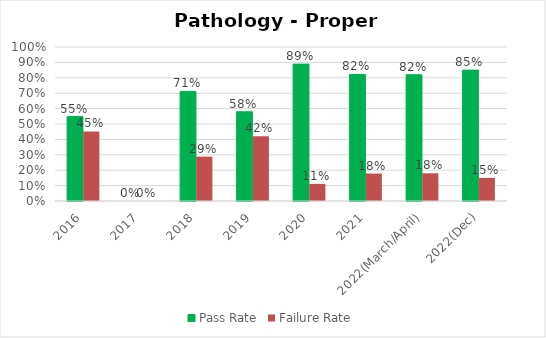
| Category | Pass Rate | Failure Rate |
|---|---|---|
| 2016 | 0.548 | 0.452 |
| 2017 | 0 | 0 |
| 2018 | 0.712 | 0.288 |
| 2019 | 0.579 | 0.421 |
| 2020 | 0.889 | 0.111 |
| 2021 | 0.822 | 0.178 |
| 2022(March/April) | 0.82 | 0.18 |
| 2022(Dec) | 0.85 | 0.15 |